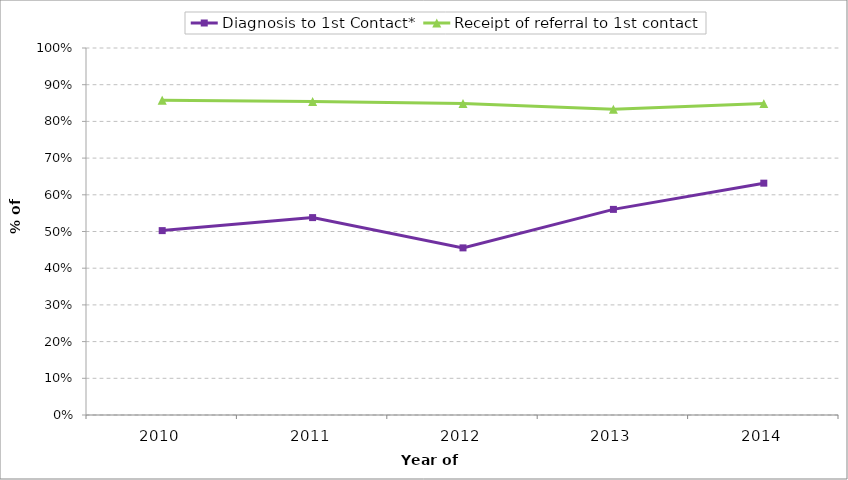
| Category | Diagnosis to 1st Contact* | Receipt of referral to 1st contact |
|---|---|---|
| 2010 | 0.502 | 0.858 |
| 2011 | 0.538 | 0.854 |
| 2012 | 0.455 | 0.849 |
| 2013 | 0.56 | 0.833 |
| 2014 | 0.632 | 0.848 |